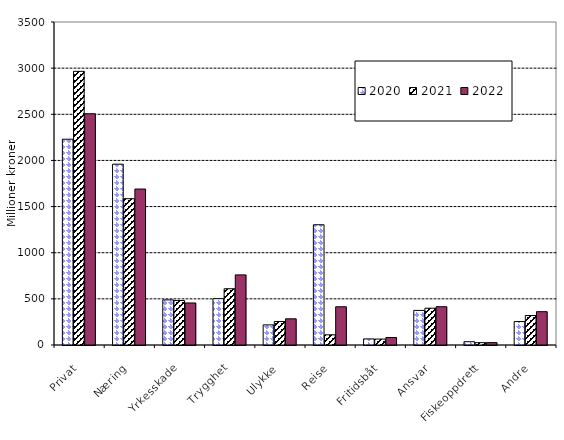
| Category | 2020 | 2021 | 2022 |
|---|---|---|---|
| Privat | 2229.879 | 2965.42 | 2505.677 |
| Næring | 1959.4 | 1585.404 | 1689.918 |
| Yrkesskade | 488.667 | 482.143 | 455.453 |
| Trygghet | 502.103 | 609.675 | 759.557 |
| Ulykke | 218.006 | 254.936 | 283.756 |
| Reise | 1302.937 | 110.552 | 414.366 |
| Fritidsbåt | 66.026 | 64.209 | 81.147 |
| Ansvar | 374.955 | 398.642 | 414.927 |
| Fiskeoppdrett | 35.68 | 25.507 | 25.872 |
| Andre | 253.991 | 319.626 | 360.989 |